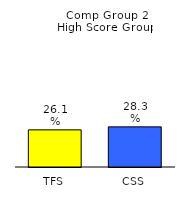
| Category | Series 0 |
|---|---|
| TFS | 0.261 |
| CSS | 0.283 |